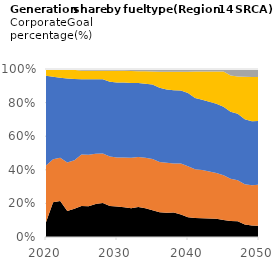
| Category | Coal_IRP | NG_IRP | Nuclear_IRP | Solar_IRP | Wind_Irp |
|---|---|---|---|---|---|
| 2020.0 | 15.8 | 60.674 | 95.823 | 7.272 | 0 |
| 2021.0 | 39.662 | 49.154 | 94.164 | 8.834 | 0 |
| 2022.0 | 43.078 | 52.134 | 95.957 | 10.408 | 0 |
| 2023.0 | 30.169 | 56.425 | 97.736 | 10.884 | 0.278 |
| 2024.0 | 33.966 | 58.539 | 98.136 | 10.959 | 1.086 |
| 2025.0 | 40.436 | 66.696 | 98.136 | 11.037 | 2.161 |
| 2026.0 | 39.974 | 66.97 | 98.136 | 11.049 | 2.385 |
| 2027.0 | 43.429 | 65.943 | 98.136 | 11.048 | 2.386 |
| 2028.0 | 44.868 | 65.386 | 98.136 | 11.045 | 2.386 |
| 2029.0 | 40.8 | 65.114 | 98.491 | 14.49 | 2.386 |
| 2030.0 | 40.146 | 64.437 | 98.845 | 15.329 | 2.385 |
| 2031.0 | 39.517 | 66.053 | 99.199 | 15.497 | 2.48 |
| 2032.0 | 38.032 | 66.668 | 99.199 | 15.739 | 2.628 |
| 2033.0 | 40.107 | 67.177 | 99.199 | 16.075 | 2.855 |
| 2034.0 | 38.666 | 67.572 | 99.199 | 16.465 | 3.148 |
| 2035.0 | 35.777 | 68.398 | 99.199 | 17.37 | 3.458 |
| 2036.0 | 33.016 | 67.298 | 99.199 | 21.65 | 3.521 |
| 2037.0 | 32.829 | 67.528 | 99.199 | 24.164 | 3.607 |
| 2038.0 | 33 | 66.469 | 99.199 | 25.107 | 3.629 |
| 2039.0 | 30.691 | 69.393 | 99.199 | 25.699 | 3.629 |
| 2040.0 | 26.696 | 68.845 | 99.199 | 28.742 | 3.628 |
| 2041.0 | 26.37 | 68.056 | 99.199 | 36.636 | 3.629 |
| 2042.0 | 26.352 | 68.382 | 99.199 | 39.928 | 3.629 |
| 2043.0 | 26.335 | 67.076 | 99.199 | 42.943 | 3.629 |
| 2044.0 | 26.316 | 65.295 | 99.199 | 46.177 | 3.629 |
| 2045.0 | 24.675 | 64.625 | 99.199 | 50.924 | 3.629 |
| 2046.0 | 23.575 | 62.755 | 99.625 | 53.528 | 9.783 |
| 2047.0 | 23.558 | 61.745 | 100.051 | 55.835 | 11.309 |
| 2048.0 | 19.439 | 62.17 | 100.051 | 65.841 | 11.797 |
| 2049.0 | 17.804 | 62.656 | 100.051 | 68.761 | 12.472 |
| 2050.0 | 17.645 | 64.683 | 100.051 | 69.03 | 12.537 |